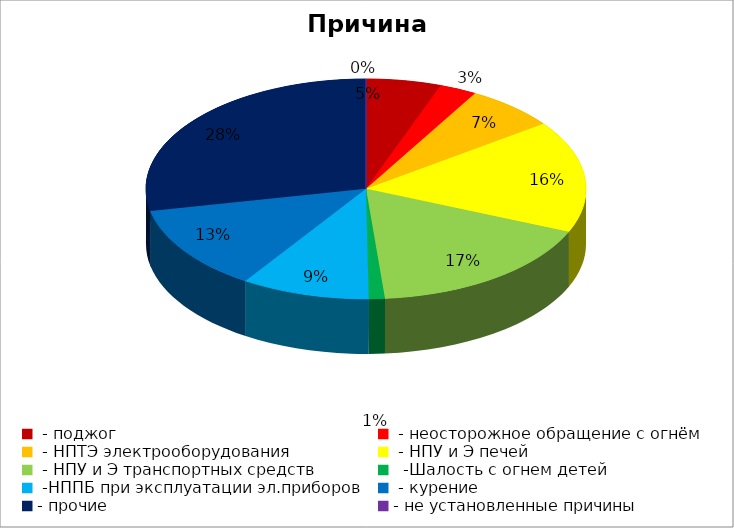
| Category | Причина пожара |
|---|---|
|  - поджог | 14 |
|  - неосторожное обращение с огнём | 7 |
|  - НПТЭ электрооборудования | 17 |
|  - НПУ и Э печей | 42 |
|  - НПУ и Э транспортных средств | 44 |
|   -Шалость с огнем детей | 3 |
|  -НППБ при эксплуатации эл.приборов | 24 |
|  - курение | 32 |
| - прочие | 72 |
| - не установленные причины | 0 |